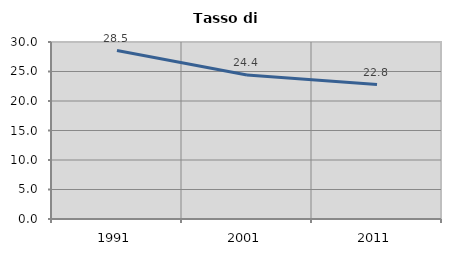
| Category | Tasso di disoccupazione   |
|---|---|
| 1991.0 | 28.545 |
| 2001.0 | 24.421 |
| 2011.0 | 22.788 |